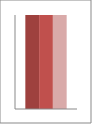
| Category | Series 1 | Series 2 | Series 3 |
|---|---|---|---|
| Point 1 | 1 | 1 | 1 |